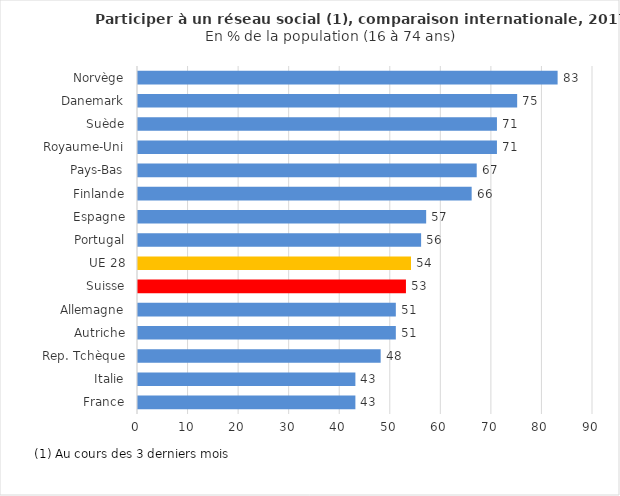
| Category | Series 0 |
|---|---|
| France | 43 |
| Italie | 43 |
| Rep. Tchèque | 48 |
| Autriche | 51 |
| Allemagne | 51 |
| Suisse | 53 |
| UE 28 | 54 |
| Portugal | 56 |
| Espagne | 57 |
| Finlande | 66 |
| Pays-Bas | 67 |
| Royaume-Uni | 71 |
| Suède | 71 |
| Danemark | 75 |
| Norvège | 83 |